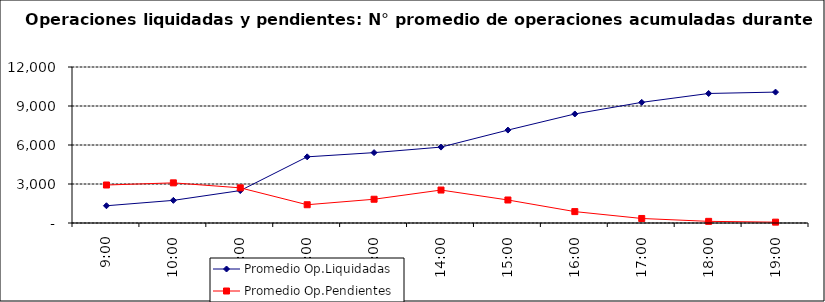
| Category | Promedio Op.Liquidadas | Promedio Op.Pendientes |
|---|---|---|
| 0.375 | 1326.55 | 2922.8 |
| 0.4166666666666667 | 1741.45 | 3088.6 |
| 0.4583333333333333 | 2495.1 | 2705.05 |
| 0.5 | 5089.9 | 1404.95 |
| 0.5416666666666666 | 5413.15 | 1827.95 |
| 0.5833333333333334 | 5838.7 | 2534.9 |
| 0.625 | 7147.25 | 1770.05 |
| 0.6666666666666666 | 8387.65 | 877.35 |
| 0.7083333333333334 | 9281.1 | 348.45 |
| 0.75 | 9963.9 | 126.4 |
| 0.7916666666666666 | 10068.8 | 65.7 |